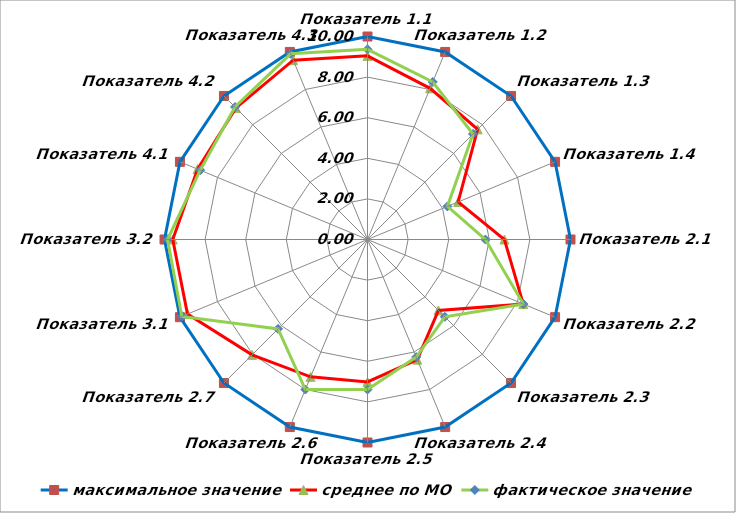
| Category | максимальное значение | среднее по МО | фактическое значение |
|---|---|---|---|
| Показатель 1.1 | 10 | 9.046 | 9.37 |
| Показатель 1.2 | 10 | 8.061 | 8.4 |
| Показатель 1.3 | 10 | 7.673 | 7.35 |
| Показатель 1.4 | 10 | 4.833 | 4.26 |
| Показатель 2.1 | 10 | 6.745 | 5.81 |
| Показатель 2.2 | 10 | 8.305 | 8.31 |
| Показатель 2.3 | 10 | 4.943 | 5.39 |
| Показатель 2.4 | 10 | 6.405 | 6.27 |
| Показатель 2.5 | 10 | 7.017 | 7.39 |
| Показатель 2.6 | 10 | 7.323 | 8 |
| Показатель 2.7 | 10 | 8.039 | 6.23 |
| Показатель 3.1 | 10 | 9.599 | 9.9 |
| Показатель 3.2 | 10 | 9.593 | 9.85 |
| Показатель 4.1 | 10 | 9.059 | 8.92 |
| Показатель 4.2 | 10 | 9.164 | 9.23 |
| Показатель 4.3 | 10 | 9.561 | 9.9 |